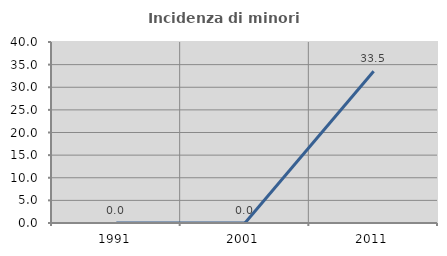
| Category | Incidenza di minori stranieri |
|---|---|
| 1991.0 | 0 |
| 2001.0 | 0 |
| 2011.0 | 33.526 |